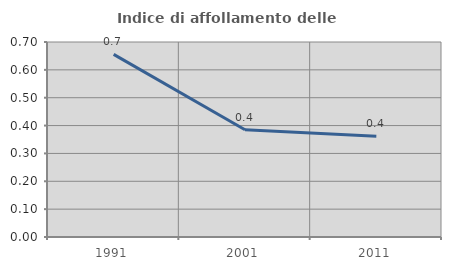
| Category | Indice di affollamento delle abitazioni  |
|---|---|
| 1991.0 | 0.656 |
| 2001.0 | 0.385 |
| 2011.0 | 0.362 |